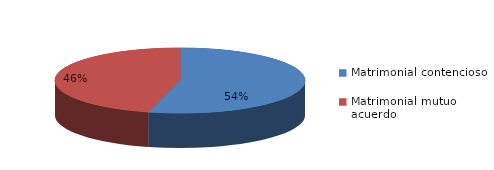
| Category | Series 0 |
|---|---|
| 0 | 443 |
| 1 | 377 |